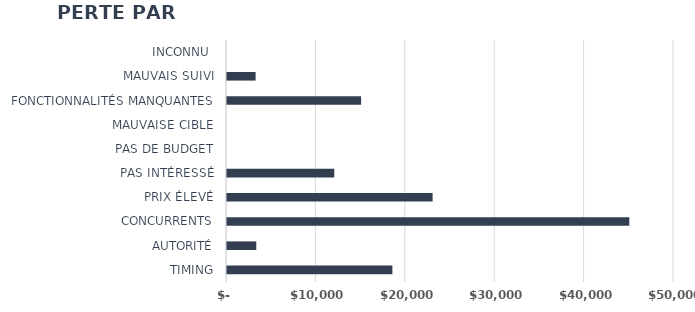
| Category | Series 1 |
|---|---|
| TIMING | 18500 |
| AUTORITÉ | 3275 |
| CONCURRENTS | 45000 |
| PRIX ÉLEVÉ | 23000 |
| PAS INTÉRESSÉ | 12000 |
| PAS DE BUDGET | 0 |
| MAUVAISE CIBLE | 0 |
| FONCTIONNALITÉS MANQUANTES | 15000 |
| MAUVAIS SUIVI | 3200 |
| INCONNU  | 0 |